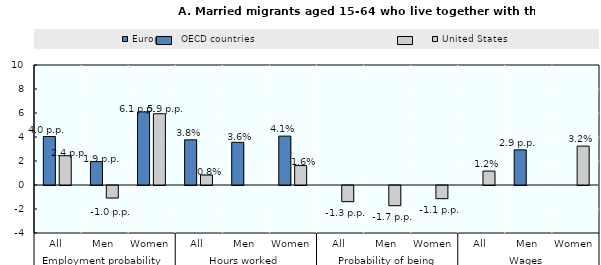
| Category | European OECD countries | United States |
|---|---|---|
| 0 | 4.042 | 2.439 |
| 1 | 1.95 | -1.043 |
| 2 | 6.093 | 5.936 |
| 3 | 3.764 | 0.831 |
| 4 | 3.555 | 0 |
| 5 | 4.073 | 1.62 |
| 6 | 0 | -1.346 |
| 7 | 0 | -1.682 |
| 8 | 0 | -1.097 |
| 9 | 0 | 1.16 |
| 10 | 2.93 | 0 |
| 11 | 0 | 3.24 |